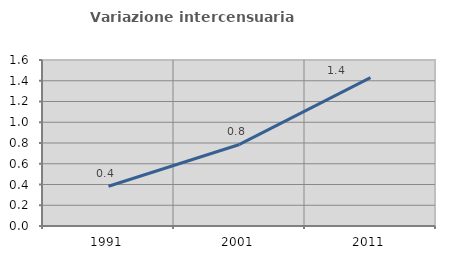
| Category | Variazione intercensuaria annua |
|---|---|
| 1991.0 | 0.383 |
| 2001.0 | 0.786 |
| 2011.0 | 1.429 |